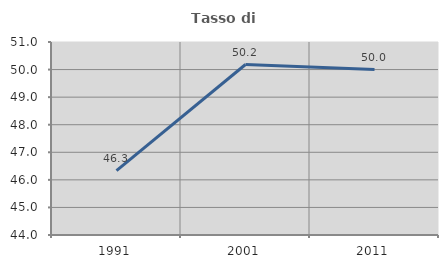
| Category | Tasso di occupazione   |
|---|---|
| 1991.0 | 46.333 |
| 2001.0 | 50.184 |
| 2011.0 | 50 |